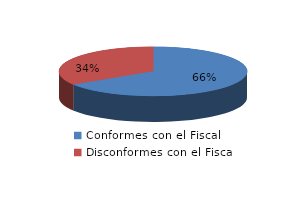
| Category | Series 0 |
|---|---|
| 0 | 91 |
| 1 | 47 |